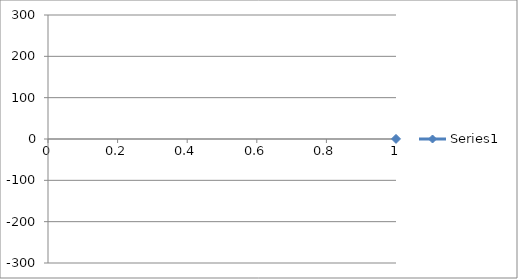
| Category | Series 0 |
|---|---|
| 0 | 0.214 |
| 1 | 0.299 |
| 2 | 0.321 |
| 3 | 0.373 |
| 4 | 0.413 |
| 5 | 0.451 |
| 6 | 0.497 |
| 7 | 0.545 |
| 8 | 0.602 |
| 9 | 0.669 |
| 10 | 0.743 |
| 11 | 0.827 |
| 12 | 0.915 |
| 13 | 1.017 |
| 14 | 1.13 |
| 15 | 1.274 |
| 16 | 1.421 |
| 17 | 1.614 |
| 18 | 1.855 |
| 19 | 2.105 |
| 20 | 2.431 |
| 21 | 2.819 |
| 22 | 3.28 |
| 23 | 3.861 |
| 24 | 4.504 |
| 25 | 5.349 |
| 26 | 6.843 |
| 27 | 8.363 |
| 28 | 10.022 |
| 29 | 12.708 |
| 30 | 15.702 |
| 31 | 17.154 |
| 32 | 18.899 |
| 33 | 20.632 |
| 34 | 23.209 |
| 35 | 25.133 |
| 36 | 27.973 |
| 37 | 30.977 |
| 38 | 34.616 |
| 39 | 38.375 |
| 40 | 42.412 |
| 41 | 47.188 |
| 42 | 51.932 |
| 43 | 58.072 |
| 44 | 64.457 |
| 45 | 71.215 |
| 46 | 79.197 |
| 47 | 87.524 |
| 48 | 96.347 |
| 49 | 105.59 |
| 50 | 115.846 |
| 51 | 126.497 |
| 52 | 137.62 |
| 53 | 148.311 |
| 54 | 159.24 |
| 55 | 170.382 |
| 56 | 181.067 |
| 57 | 190.702 |
| 58 | 199.845 |
| 59 | 208.359 |
| 60 | 215.569 |
| 61 | 221.466 |
| 62 | 225.588 |
| 63 | 228.31 |
| 64 | 229.66 |
| 65 | 229.368 |
| 66 | 226.83 |
| 67 | 222.372 |
| 68 | 216.401 |
| 69 | 207.927 |
| 70 | 197.804 |
| 71 | 184.829 |
| 72 | 170.146 |
| 73 | 153.951 |
| 74 | 136.067 |
| 75 | 115.841 |
| 76 | 94.351 |
| 77 | 71.498 |
| 78 | 48.714 |
| 79 | 24.06 |
| 80 | -1.117 |
| 81 | -25.938 |
| 82 | -49.588 |
| 83 | -73.892 |
| 84 | -96.682 |
| 85 | -118.319 |
| 86 | -137.602 |
| 87 | -155.818 |
| 88 | -172.193 |
| 89 | -186.248 |
| 90 | -197.801 |
| 91 | -208.117 |
| 92 | -216.346 |
| 93 | -222.974 |
| 94 | -226.859 |
| 95 | -228.82 |
| 96 | -229.396 |
| 97 | -228.979 |
| 98 | -226.014 |
| 99 | -221.487 |
| 100 | -215.533 |
| 101 | -208.145 |
| 102 | -199.799 |
| 103 | -190.54 |
| 104 | -180.463 |
| 105 | -169.576 |
| 106 | -158.642 |
| 107 | -147.526 |
| 108 | -136.202 |
| 109 | -125.19 |
| 110 | -114.944 |
| 111 | -104.731 |
| 112 | -95.467 |
| 113 | -86.681 |
| 114 | -78.074 |
| 115 | -70.969 |
| 116 | -63.58 |
| 117 | -57.397 |
| 118 | -51.671 |
| 119 | -46.532 |
| 120 | -41.792 |
| 121 | -38.113 |
| 122 | -34.094 |
| 123 | -31.189 |
| 124 | -28.239 |
| 125 | -25.466 |
| 126 | -23.282 |
| 127 | -20.713 |
| 128 | -19.2 |
| 129 | -17.486 |
| 130 | -15.965 |
| 131 | -12.969 |
| 132 | -10.266 |
| 133 | -8.603 |
| 134 | -6.984 |
| 135 | -5.638 |
| 136 | -5.05 |
| 137 | -4.314 |
| 138 | -3.653 |
| 139 | -3.083 |
| 140 | -2.635 |
| 141 | -2.262 |
| 142 | -1.93 |
| 143 | -1.636 |
| 144 | -1.377 |
| 145 | -1.207 |
| 146 | -1.037 |
| 147 | -0.892 |
| 148 | -0.785 |
| 149 | -0.673 |
| 150 | -0.559 |
| 151 | -0.445 |
| 152 | -0.394 |
| 153 | -0.339 |
| 154 | -0.277 |
| 155 | -0.231 |
| 156 | -0.187 |
| 157 | -0.167 |
| 158 | -0.124 |
| 159 | -0.074 |
| 160 | -0.056 |